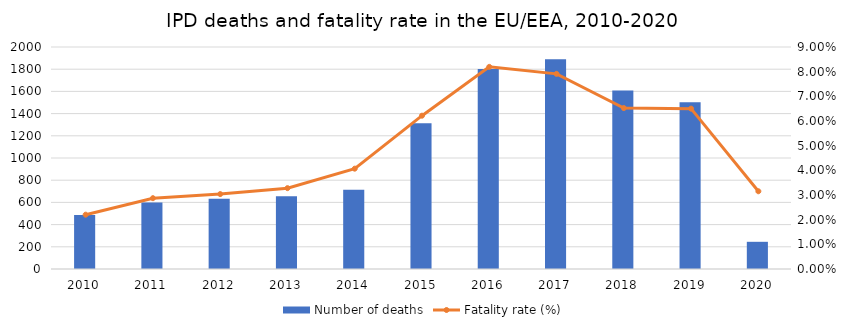
| Category | Number of deaths |
|---|---|
| 2010.0 | 486 |
| 2011.0 | 598 |
| 2012.0 | 634 |
| 2013.0 | 656 |
| 2014.0 | 713 |
| 2015.0 | 1313 |
| 2016.0 | 1802 |
| 2017.0 | 1890 |
| 2018.0 | 1609 |
| 2019.0 | 1503 |
| 2020.0 | 245 |